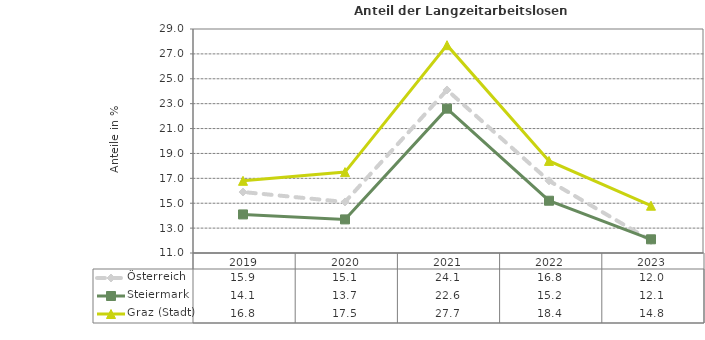
| Category | Österreich | Steiermark | Graz (Stadt) |
|---|---|---|---|
| 2023.0 | 12 | 12.1 | 14.8 |
| 2022.0 | 16.8 | 15.2 | 18.4 |
| 2021.0 | 24.1 | 22.6 | 27.7 |
| 2020.0 | 15.1 | 13.7 | 17.5 |
| 2019.0 | 15.9 | 14.1 | 16.8 |